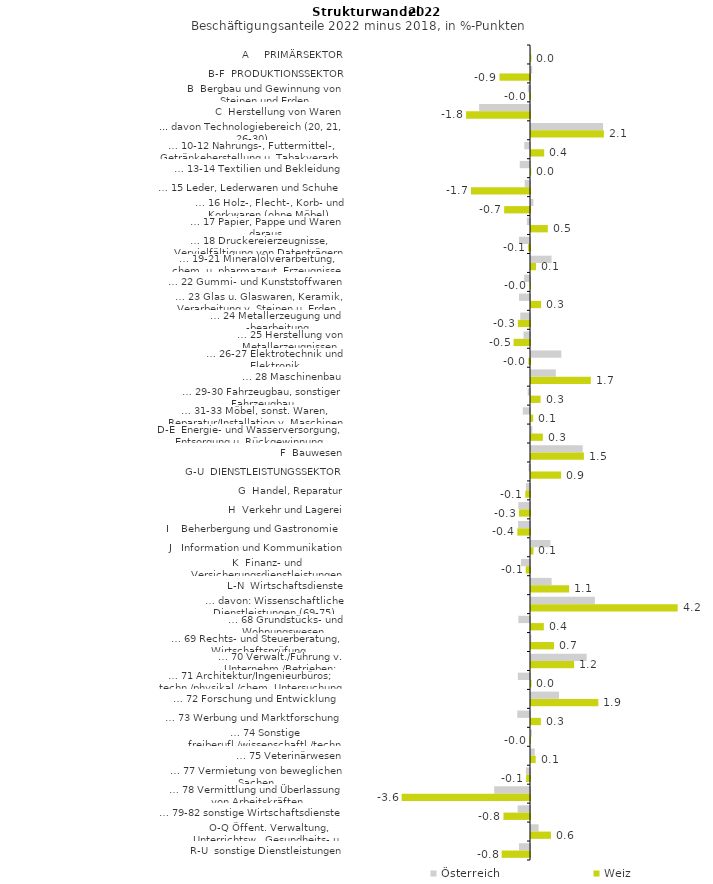
| Category | Österreich | Weiz |
|---|---|---|
| A     PRIMÄRSEKTOR | 0.004 | 0.012 |
| B-F  PRODUKTIONSSEKTOR | 0.036 | -0.867 |
| B  Bergbau und Gewinnung von Steinen und Erden | -0.063 | -0.018 |
| C  Herstellung von Waren | -1.445 | -1.816 |
| ... davon Technologiebereich (20, 21, 26-30) | 2.047 | 2.07 |
| … 10-12 Nahrungs-, Futtermittel-, Getränkeherstellung u. Tabakverarb. | -0.163 | 0.375 |
| … 13-14 Textilien und Bekleidung | -0.292 | 0.007 |
| … 15 Leder, Lederwaren und Schuhe | -0.15 | -1.676 |
| … 16 Holz-, Flecht-, Korb- und Korkwaren (ohne Möbel)  | 0.068 | -0.734 |
| … 17 Papier, Pappe und Waren daraus  | -0.09 | 0.478 |
| … 18 Druckereierzeugnisse, Vervielfältigung von Datenträgern | -0.314 | -0.055 |
| … 19-21 Mineralölverarbeitung, chem. u. pharmazeut. Erzeugnisse | 0.584 | 0.143 |
| … 22 Gummi- und Kunststoffwaren | -0.168 | -0.005 |
| … 23 Glas u. Glaswaren, Keramik, Verarbeitung v. Steinen u. Erden  | -0.312 | 0.288 |
| … 24 Metallerzeugung und -bearbeitung | -0.276 | -0.345 |
| … 25 Herstellung von Metallerzeugnissen  | -0.185 | -0.466 |
| … 26-27 Elektrotechnik und Elektronik | 0.862 | -0.044 |
| … 28 Maschinenbau | 0.705 | 1.7 |
| … 29-30 Fahrzeugbau, sonstiger Fahrzeugbau | -0.066 | 0.272 |
| … 31-33 Möbel, sonst. Waren, Reparatur/Installation v. Maschinen | -0.204 | 0.062 |
| D-E  Energie- und Wasserversorgung, Entsorgung u. Rückgewinnung | 0.038 | 0.337 |
| F  Bauwesen | 1.469 | 1.503 |
| G-U  DIENSTLEISTUNGSSEKTOR | -0.04 | 0.855 |
| G  Handel, Reparatur | -0.115 | -0.132 |
| H  Verkehr und Lagerei | -0.33 | -0.312 |
| I    Beherbergung und Gastronomie | -0.34 | -0.361 |
| J   Information und Kommunikation | 0.551 | 0.071 |
| K  Finanz- und Versicherungsdienstleistungen | -0.255 | -0.121 |
| L-N  Wirtschaftsdienste | 0.586 | 1.083 |
| … davon: Wissenschaftliche Dienstleistungen (69-75) | 1.815 | 4.168 |
| … 68 Grundstücks- und Wohnungswesen  | -0.331 | 0.365 |
| … 69 Rechts- und Steuerberatung, Wirtschaftsprüfung | 0.008 | 0.653 |
| … 70 Verwalt./Führung v. Unternehm./Betrieben; Unternehmensberat. | 1.583 | 1.225 |
| … 71 Architektur/Ingenieurbüros; techn./physikal./chem. Untersuchung | -0.344 | 0.014 |
| … 72 Forschung und Entwicklung  | 0.797 | 1.912 |
| … 73 Werbung und Marktforschung | -0.361 | 0.281 |
| … 74 Sonstige freiberufl./wissenschaftl./techn. Tätigkeiten | 0.025 | -0.01 |
| … 75 Veterinärwesen | 0.108 | 0.134 |
| … 77 Vermietung von beweglichen Sachen  | -0.116 | -0.11 |
| … 78 Vermittlung und Überlassung von Arbeitskräften | -1.018 | -3.646 |
| … 79-82 sonstige Wirtschaftsdienste | -0.351 | -0.754 |
| O-Q Öffent. Verwaltung, Unterrichtsw., Gesundheits- u. Sozialwesen | 0.216 | 0.567 |
| R-U  sonstige Dienstleistungen | -0.314 | -0.806 |